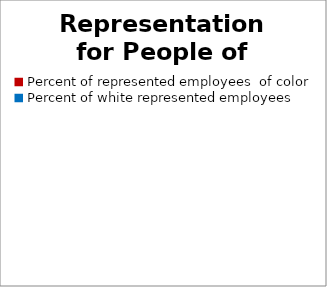
| Category | Series 0 |
|---|---|
| Percent of represented employees  of color | 0 |
| Percent of white represented employees  | 0 |